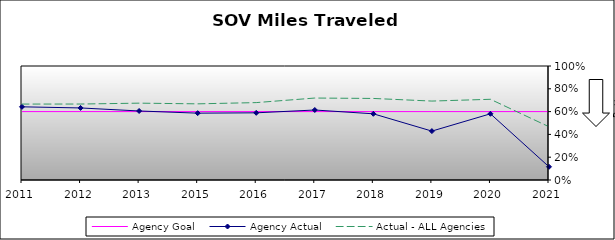
| Category | Agency Goal | Agency Actual | Actual - ALL Agencies |
|---|---|---|---|
| 2011.0 | 0.6 | 0.642 | 0.666 |
| 2012.0 | 0.6 | 0.632 | 0.666 |
| 2013.0 | 0.6 | 0.606 | 0.674 |
| 2015.0 | 0.6 | 0.586 | 0.668 |
| 2016.0 | 0.6 | 0.589 | 0.679 |
| 2017.0 | 0.6 | 0.614 | 0.719 |
| 2018.0 | 0.6 | 0.581 | 0.715 |
| 2019.0 | 0.6 | 0.429 | 0.692 |
| 2020.0 | 0.6 | 0.581 | 0.708 |
| 2021.0 | 0.6 | 0.116 | 0.467 |